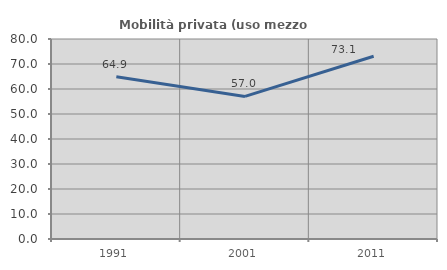
| Category | Mobilità privata (uso mezzo privato) |
|---|---|
| 1991.0 | 64.894 |
| 2001.0 | 57.037 |
| 2011.0 | 73.103 |